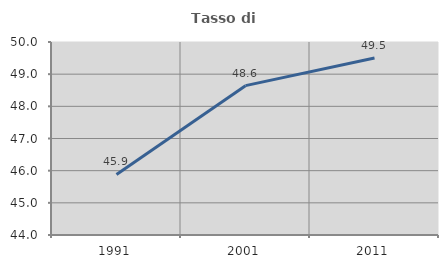
| Category | Tasso di occupazione   |
|---|---|
| 1991.0 | 45.883 |
| 2001.0 | 48.643 |
| 2011.0 | 49.501 |